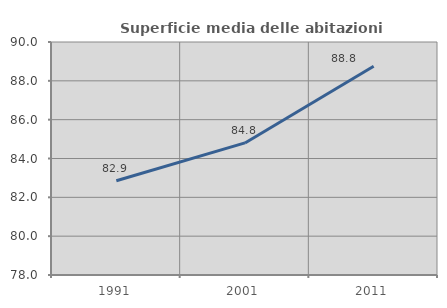
| Category | Superficie media delle abitazioni occupate |
|---|---|
| 1991.0 | 82.857 |
| 2001.0 | 84.803 |
| 2011.0 | 88.751 |